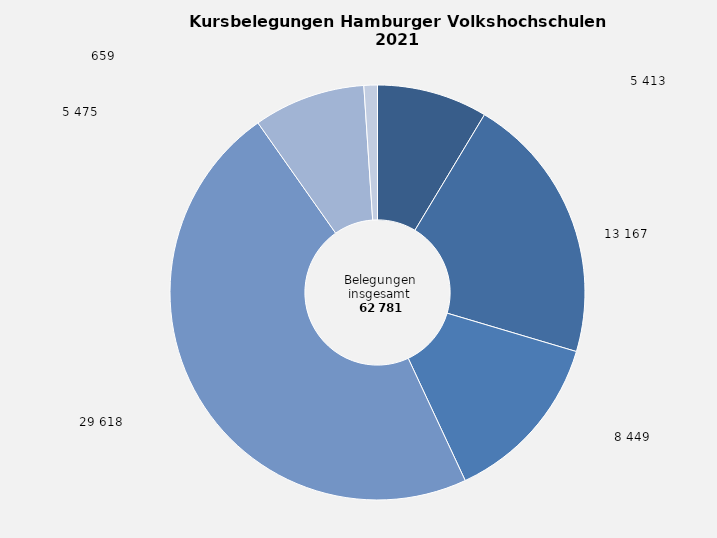
| Category | Anteil in Prozent |
|---|---|
| Politik, Gesellschaft, Umwelt | 8.622 |
| Kultur, Gestalten | 20.973 |
| Gesundheit | 13.458 |
| Sprachen | 47.177 |
| Qualifikationen für das Arbeitsleben - IT - 
Organisation/Management | 8.721 |
| Grundbildung, Schulabschlüsse | 1.05 |